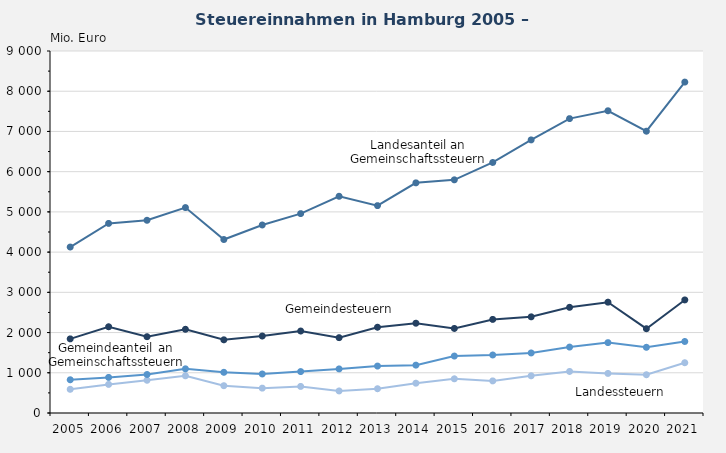
| Category | Landessteuern | Landesanteil an Gemeinschaftssteuern | Gemeindesteuern | Gemeindeanteil an Gemeinschaftssteuern |
|---|---|---|---|---|
| 2005.0 | 589 | 4126 | 1843 | 826 |
| 2006.0 | 711 | 4714 | 2144 | 885 |
| 2007.0 | 814 | 4791 | 1897 | 957 |
| 2008.0 | 925 | 5107 | 2081 | 1098 |
| 2009.0 | 679 | 4313 | 1820 | 1012 |
| 2010.0 | 618 | 4675 | 1914 | 970 |
| 2011.0 | 661 | 4957 | 2038 | 1030 |
| 2012.0 | 548 | 5388 | 1873 | 1096 |
| 2013.0 | 604 | 5156 | 2132 | 1167 |
| 2014.0 | 741 | 5722 | 2232 | 1190 |
| 2015.0 | 850 | 5797 | 2102 | 1416 |
| 2016.0 | 798 | 6229 | 2327 | 1442 |
| 2017.0 | 925 | 6790 | 2391 | 1493 |
| 2018.0 | 1033 | 7319 | 2627 | 1639 |
| 2019.0 | 984 | 7514 | 2755 | 1750 |
| 2020.0 | 951 | 7006 | 2096 | 1633 |
| 2021.0 | 1250 | 8227 | 2811 | 1778 |